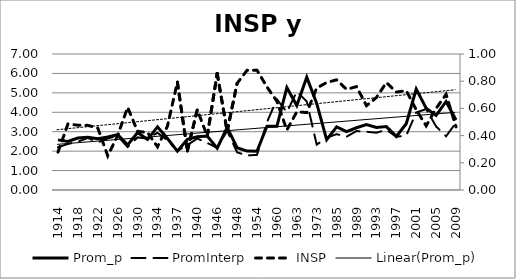
| Category | Prom_p | PromInterp |
|---|---|---|
| 1914.0 | 2.581 | 2.202 |
| 1916.0 | 2.495 | 2.369 |
| 1918.0 | 2.677 | 2.486 |
| 1920.0 | 2.716 | 2.679 |
| 1922.0 | 2.638 | 2.453 |
| 1924.0 | 2.73 | 2.655 |
| 1926.0 | 2.848 | 2.786 |
| 1928.0 | 2.322 | 2.207 |
| 1930.0 | 2.962 | 2.71 |
| 1931.0 | 2.596 | 2.64 |
| 1934.0 | 3.249 | 2.946 |
| 1936.0 | 2.648 | 2.557 |
| 1937.0 | 1.996 | 2.015 |
| 1938.0 | 2.607 | 2.317 |
| 1940.0 | 2.739 | 2.647 |
| 1942.0 | 2.775 | 2.42 |
| 1946.0 | 2.152 | 2.173 |
| 1946.0 | 3.224 | 3.052 |
| 1948.0 | 2.176 | 1.938 |
| 1951.0 | 2.005 | 1.779 |
| 1954.0 | 1.99 | 1.809 |
| 1958.0 | 3.28 | 3.492 |
| 1960.0 | 3.28 | 4.666 |
| 1962.0 | 5.275 | 4.005 |
| 1963.0 | 4.35 | 5.065 |
| 1965.0 | 5.809 | 4.556 |
| 1973.0 | 4.459 | 2.334 |
| 1983.0 | 2.587 | 2.694 |
| 1985.0 | 3.253 | 2.875 |
| 1987.0 | 3.004 | 2.744 |
| 1989.0 | 3.204 | 3.035 |
| 1991.0 | 3.37 | 2.999 |
| 1993.0 | 3.22 | 2.948 |
| 1995.0 | 3.263 | 3.103 |
| 1997.0 | 2.758 | 2.74 |
| 1999.0 | 3.413 | 2.806 |
| 2001.0 | 5.193 | 3.989 |
| 2003.0 | 4.207 | 4.166 |
| 2005.0 | 3.838 | 3.27 |
| 2007.0 | 4.556 | 2.765 |
| 2009.0 | 3.604 | 3.464 |